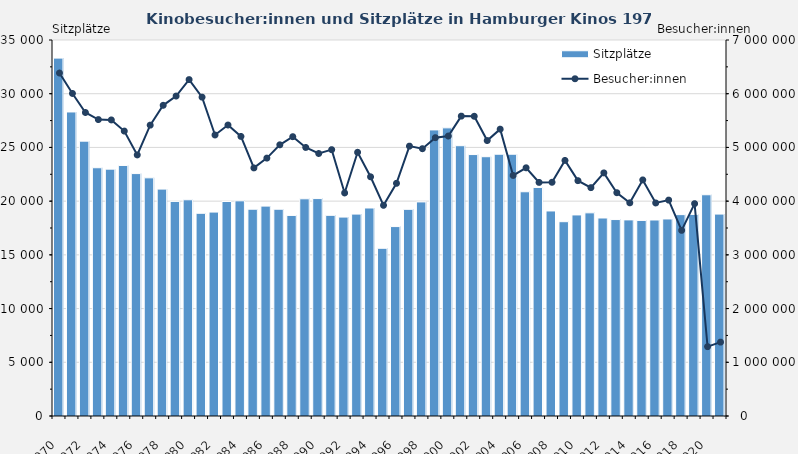
| Category | Sitzplätze |
|---|---|
| 0 | 33313 |
| 1 | 28302 |
| 2 | 25585 |
| 3 | 23109 |
| 4 | 22980 |
| 5 | 23322 |
| 6 | 22565 |
| 7 | 22169 |
| 8 | 21120 |
| 9 | 19977 |
| 10 | 20128 |
| 11 | 18869 |
| 12 | 18982 |
| 13 | 19967 |
| 14 | 20030 |
| 15 | 19249 |
| 16 | 19537 |
| 17 | 19248 |
| 18 | 18671 |
| 19 | 20217 |
| 20 | 20240 |
| 21 | 18679 |
| 22 | 18516 |
| 23 | 18794 |
| 24 | 19362 |
| 25 | 15612 |
| 26 | 17633 |
| 27 | 19237 |
| 28 | 19928 |
| 29 | 26631 |
| 30 | 26822 |
| 31 | 25160 |
| 32 | 24337 |
| 33 | 24136 |
| 34 | 24367 |
| 35 | 24367 |
| 36 | 20873 |
| 37 | 21273 |
| 38 | 19086 |
| 39 | 18087 |
| 40 | 18716 |
| 41 | 18912 |
| 42 | 18432 |
| 43 | 18286 |
| 44 | 18256 |
| 45 | 18205 |
| 46 | 18245 |
| 47 | 18341 |
| 48 | 18744 |
| 49 | 18764 |
| 50 | 20595 |
| 51 | 18795 |